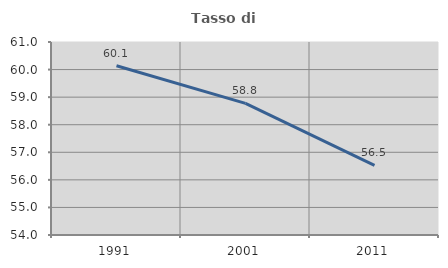
| Category | Tasso di occupazione   |
|---|---|
| 1991.0 | 60.138 |
| 2001.0 | 58.775 |
| 2011.0 | 56.525 |